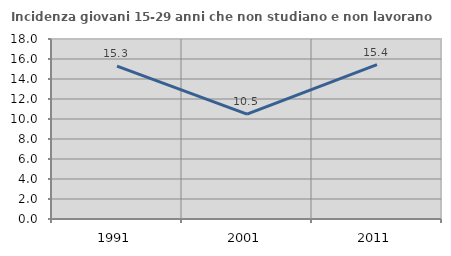
| Category | Incidenza giovani 15-29 anni che non studiano e non lavorano  |
|---|---|
| 1991.0 | 15.28 |
| 2001.0 | 10.49 |
| 2011.0 | 15.436 |